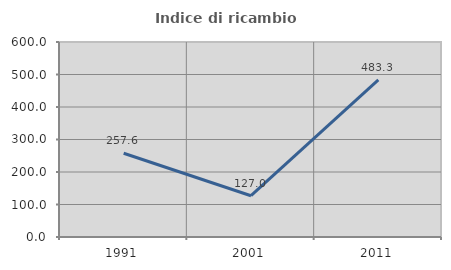
| Category | Indice di ricambio occupazionale  |
|---|---|
| 1991.0 | 257.576 |
| 2001.0 | 127.027 |
| 2011.0 | 483.333 |